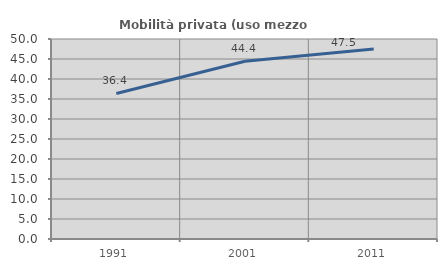
| Category | Mobilità privata (uso mezzo privato) |
|---|---|
| 1991.0 | 36.382 |
| 2001.0 | 44.433 |
| 2011.0 | 47.476 |